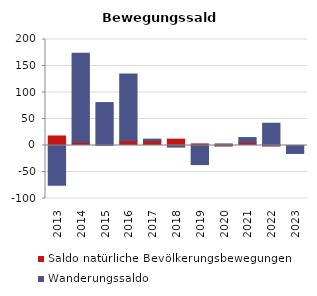
| Category | Saldo natürliche Bevölkerungsbewegungen | Wanderungssaldo |
|---|---|---|
| 2013.0 | 18 | -75 |
| 2014.0 | 6 | 168 |
| 2015.0 | 0 | 81 |
| 2016.0 | 9 | 126 |
| 2017.0 | 9 | 3 |
| 2018.0 | 12 | -3 |
| 2019.0 | 3 | -36 |
| 2020.0 | -3 | 3 |
| 2021.0 | 6 | 9 |
| 2022.0 | -3 | 42 |
| 2023.0 | 0 | -15 |